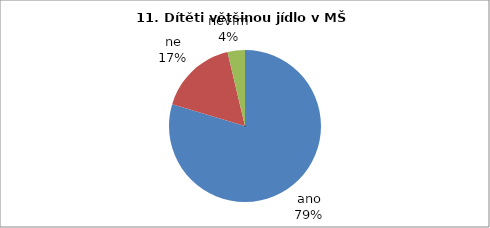
| Category | 11. |
|---|---|
| ano | 43 |
| ne | 9 |
| nevím | 2 |